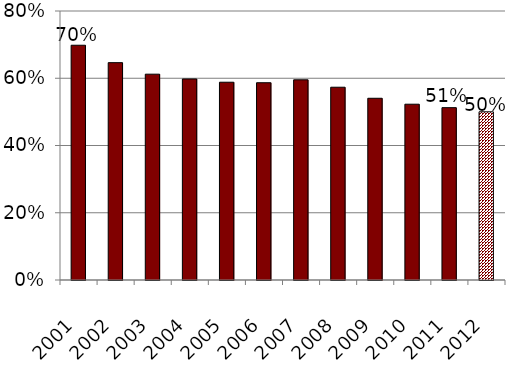
| Category | Series 0 |
|---|---|
| 2001.0 | 0.698 |
| 2002.0 | 0.646 |
| 2003.0 | 0.612 |
| 2004.0 | 0.598 |
| 2005.0 | 0.588 |
| 2006.0 | 0.587 |
| 2007.0 | 0.595 |
| 2008.0 | 0.573 |
| 2009.0 | 0.54 |
| 2010.0 | 0.523 |
| 2011.0 | 0.513 |
| 2012.0 | 0.5 |